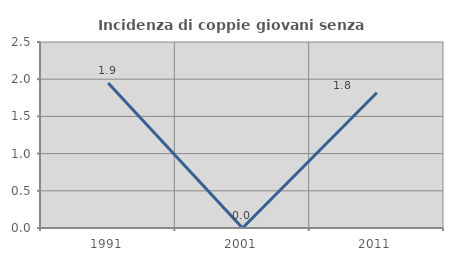
| Category | Incidenza di coppie giovani senza figli |
|---|---|
| 1991.0 | 1.948 |
| 2001.0 | 0 |
| 2011.0 | 1.818 |